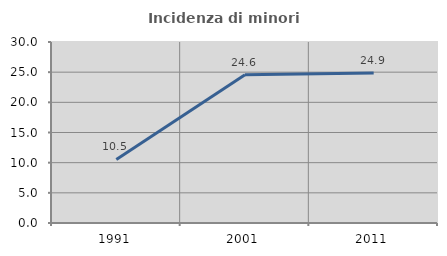
| Category | Incidenza di minori stranieri |
|---|---|
| 1991.0 | 10.526 |
| 2001.0 | 24.561 |
| 2011.0 | 24.87 |